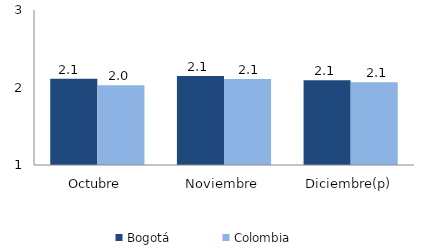
| Category | Bogotá | Colombia |
|---|---|---|
| Octubre | 2.113 | 2.029 |
| Noviembre | 2.148 | 2.111 |
| Diciembre(p) | 2.093 | 2.069 |